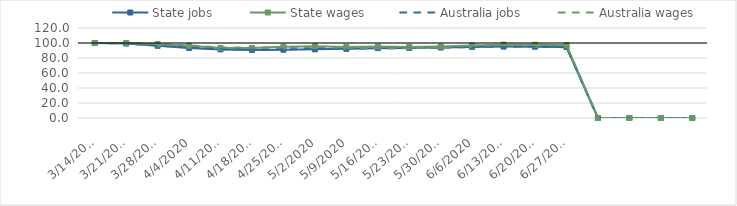
| Category | State jobs | State wages | Australia jobs | Australia wages |
|---|---|---|---|---|
| 14/03/2020 | 100 | 100 | 100 | 100 |
| 21/03/2020 | 99.254 | 100.014 | 99.389 | 100.07 |
| 28/03/2020 | 96.234 | 98.425 | 96.608 | 98.707 |
| 04/04/2020 | 93.393 | 96.417 | 93.828 | 96.765 |
| 11/04/2020 | 91.405 | 93.439 | 91.887 | 94.047 |
| 18/04/2020 | 90.801 | 93.432 | 91.31 | 93.932 |
| 25/04/2020 | 91.005 | 95.152 | 91.6 | 94.326 |
| 02/05/2020 | 91.513 | 95.722 | 91.954 | 94.889 |
| 09/05/2020 | 92.216 | 94.833 | 92.449 | 93.491 |
| 16/05/2020 | 93.148 | 95.218 | 92.97 | 93.144 |
| 23/05/2020 | 93.339 | 94.628 | 93.251 | 92.924 |
| 30/05/2020 | 93.933 | 95.36 | 93.813 | 94.361 |
| 06/06/2020 | 94.797 | 96.712 | 94.668 | 96.401 |
| 13/06/2020 | 95.189 | 97.818 | 95.11 | 97.158 |
| 20/06/2020 | 95.103 | 97.596 | 95.246 | 97.537 |
| 27/06/2020 | 94.522 | 97.056 | 94.328 | 96.826 |